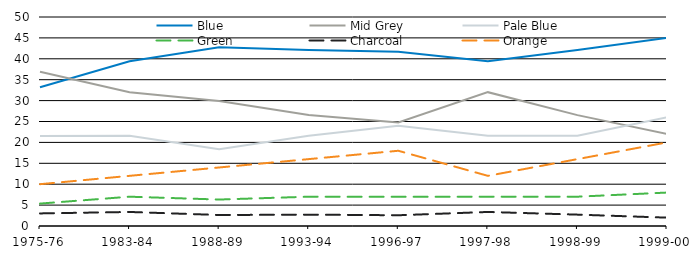
| Category | Blue | Mid Grey | Pale Blue | Green | Charcoal | Orange |
|---|---|---|---|---|---|---|
| 1975-76 | 33.19 | 36.88 | 21.56 | 5.36 | 3.01 | 10 |
| 1983-84 | 39.39 | 32.02 | 21.6 | 7.01 | 3.36 | 12 |
| 1988-89 | 42.78 | 29.91 | 18.35 | 6.33 | 2.63 | 14 |
| 1993-94 | 42.13 | 26.53 | 21.6 | 7.01 | 2.72 | 16 |
| 1996-97 | 41.69 | 24.76 | 23.98 | 7 | 2.57 | 18 |
| 1997-98 | 39.39 | 32.02 | 21.6 | 7.01 | 3.36 | 12 |
| 1998-99 | 42.13 | 26.53 | 21.6 | 7.01 | 2.72 | 16 |
| 1999-00 | 45 | 22 | 26 | 8 | 2 | 20 |